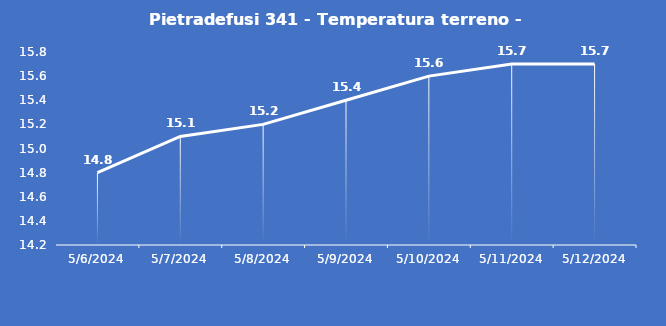
| Category | Pietradefusi 341 - Temperatura terreno - Grezzo (°C) |
|---|---|
| 5/6/24 | 14.8 |
| 5/7/24 | 15.1 |
| 5/8/24 | 15.2 |
| 5/9/24 | 15.4 |
| 5/10/24 | 15.6 |
| 5/11/24 | 15.7 |
| 5/12/24 | 15.7 |